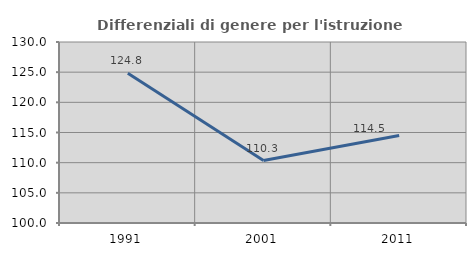
| Category | Differenziali di genere per l'istruzione superiore |
|---|---|
| 1991.0 | 124.827 |
| 2001.0 | 110.349 |
| 2011.0 | 114.502 |